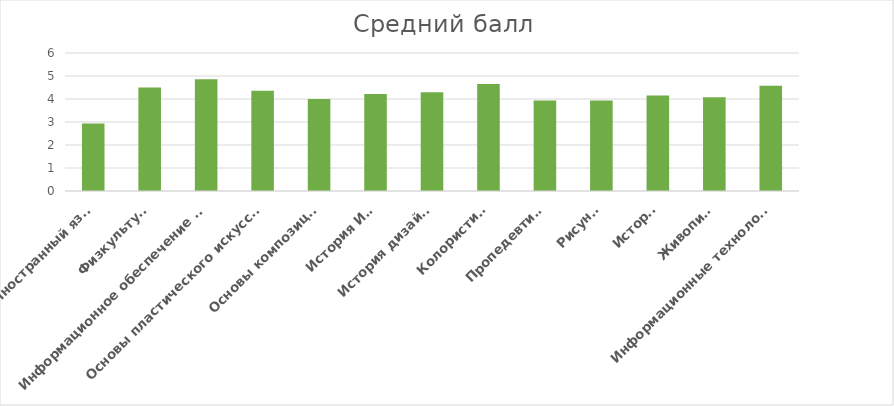
| Category | Средний балл |
|---|---|
| Иностранный язык | 2.93 |
| Физкультура | 4.5 |
| Информационное обеспечение в проф.деятельности | 4.86 |
| Основы пластического искусства | 4.36 |
| Основы композиции | 4 |
| История ИЗО | 4.22 |
| История дизайна | 4.29 |
| Колористика | 4.65 |
| Пропедевтика | 3.93 |
| Рисунок | 3.93 |
| История | 4.15 |
| Живопись | 4.08 |
| Информационные технологии  | 4.58 |